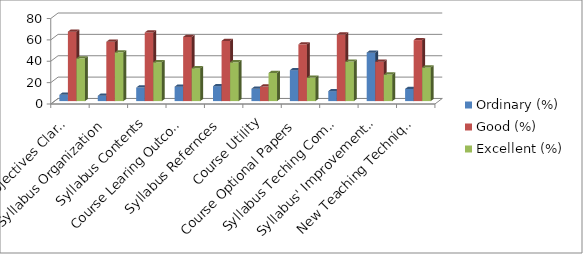
| Category | Ordinary (%) | Good (%) | Excellent (%) |
|---|---|---|---|
| Course Objectives Clarity | 5.9 | 65 | 40 |
| Syllabus Organization | 5 | 55.5 | 45.63 |
| Syllabus Contents | 12.68 | 64.21 | 36.33 |
| Course Learing Outcomes | 13.5 | 60.11 | 30.78 |
| Syllabus Refernces  | 14 | 56.32 | 36.32 |
| Course Utility | 11.59 | 13.6 | 26.32 |
| Course Optional Papers | 28.97 | 53.13 | 21.99 |
| Syllabus Teching Compatibility  | 9.32 | 62.32 | 36.98 |
| Syllabus' Improvement Scope | 45.37 | 36.87 | 24.84 |
| New Teaching Techniques | 11.4 | 57.1 | 31.5 |